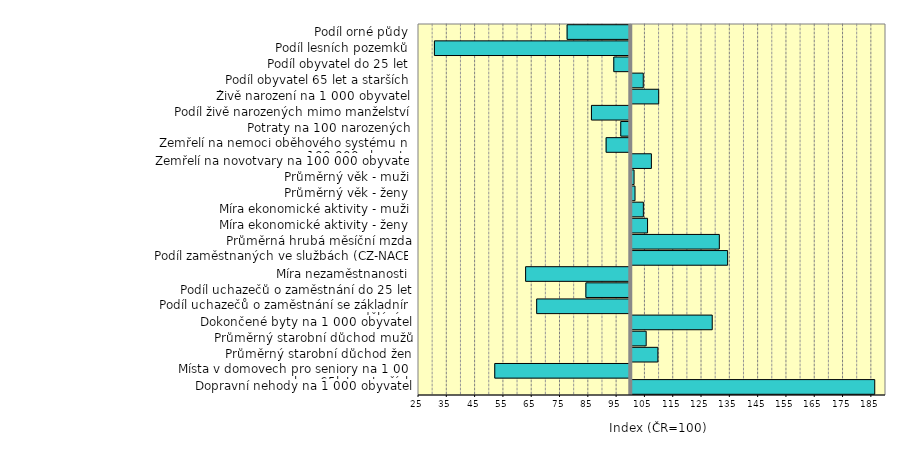
| Category | Series 0 |
|---|---|
| Dopravní nehody na 1 000 obyvatel | 186.022 |
| Místa v domovech pro seniory na 1 000 obyv 65let a starších | 51.942 |
| Průměrný starobní důchod žen | 109.402 |
| Průměrný starobní důchod mužů | 105.267 |
| Dokončené byty na 1 000 obyvatel | 128.61 |
| Podíl uchazečů o zaměstnání se základním vzděláním | 66.755 |
| Podíl uchazečů o zaměstnání do 25 let | 84.14 |
| Míra nezaměstnanosti | 62.844 |
| Podíl zaměstnaných ve službách (CZ-NACE) | 134.047 |
| Průměrná hrubá měsíční mzda | 131.115 |
| Míra ekonomické aktivity - ženy | 105.752 |
| Míra ekonomické aktivity - muži | 104.275 |
| Průměrný věk - ženy | 101.325 |
| Průměrný věk - muži | 100.99 |
| Zemřelí na novotvary na 100 000 obyvatel | 107.111 |
| Zemřelí na nemoci oběhového systému na 100 000 obyvatel | 91.294 |
| Potraty na 100 narozených | 96.459 |
| Podíl živě narozených mimo manželství | 86.108 |
| Živě narození na 1 000 obyvatel | 109.687 |
| Podíl obyvatel 65 let a starších | 104.24 |
| Podíl obyvatel do 25 let | 93.998 |
| Podíl lesních pozemků | 30.625 |
| Podíl orné půdy | 77.511 |